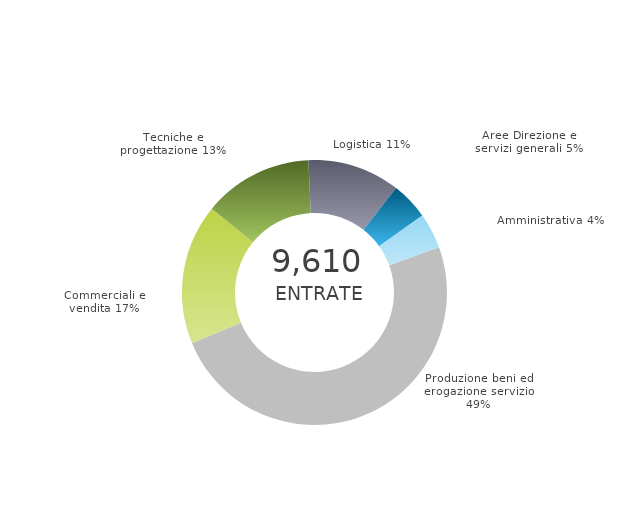
| Category | Series 0 | Series 1 |
|---|---|---|
| Produzione beni ed erogazione servizio | 0 | 0.493 |
| Commerciali e vendita | 0 | 0.171 |
| Tecniche e progettazione | 0 | 0.134 |
| Logistica | 0 | 0.113 |
| Aree Direzione e servizi generali | 0 | 0.046 |
| Amministrativa | 0 | 0.043 |